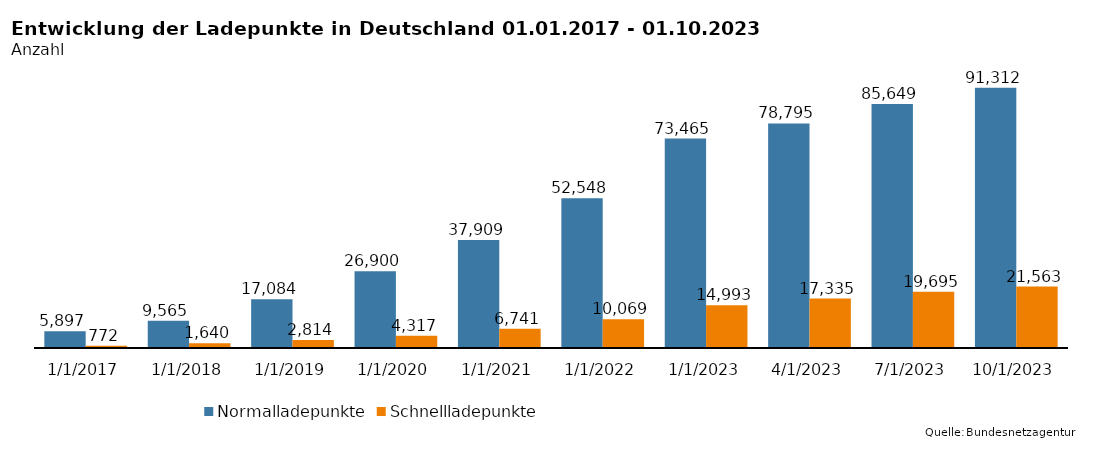
| Category | Normalladepunkte | Schnellladepunkte |
|---|---|---|
| 1/1/17 | 5897 | 772 |
| 1/1/18 | 9565 | 1640 |
| 1/1/19 | 17084 | 2814 |
| 1/1/20 | 26900 | 4317 |
| 1/1/21 | 37909 | 6741 |
| 1/1/22 | 52548 | 10069 |
| 1/1/23 | 73465 | 14993 |
| 4/1/23 | 78795 | 17335 |
| 7/1/23 | 85649 | 19695 |
| 10/1/23 | 91312 | 21563 |